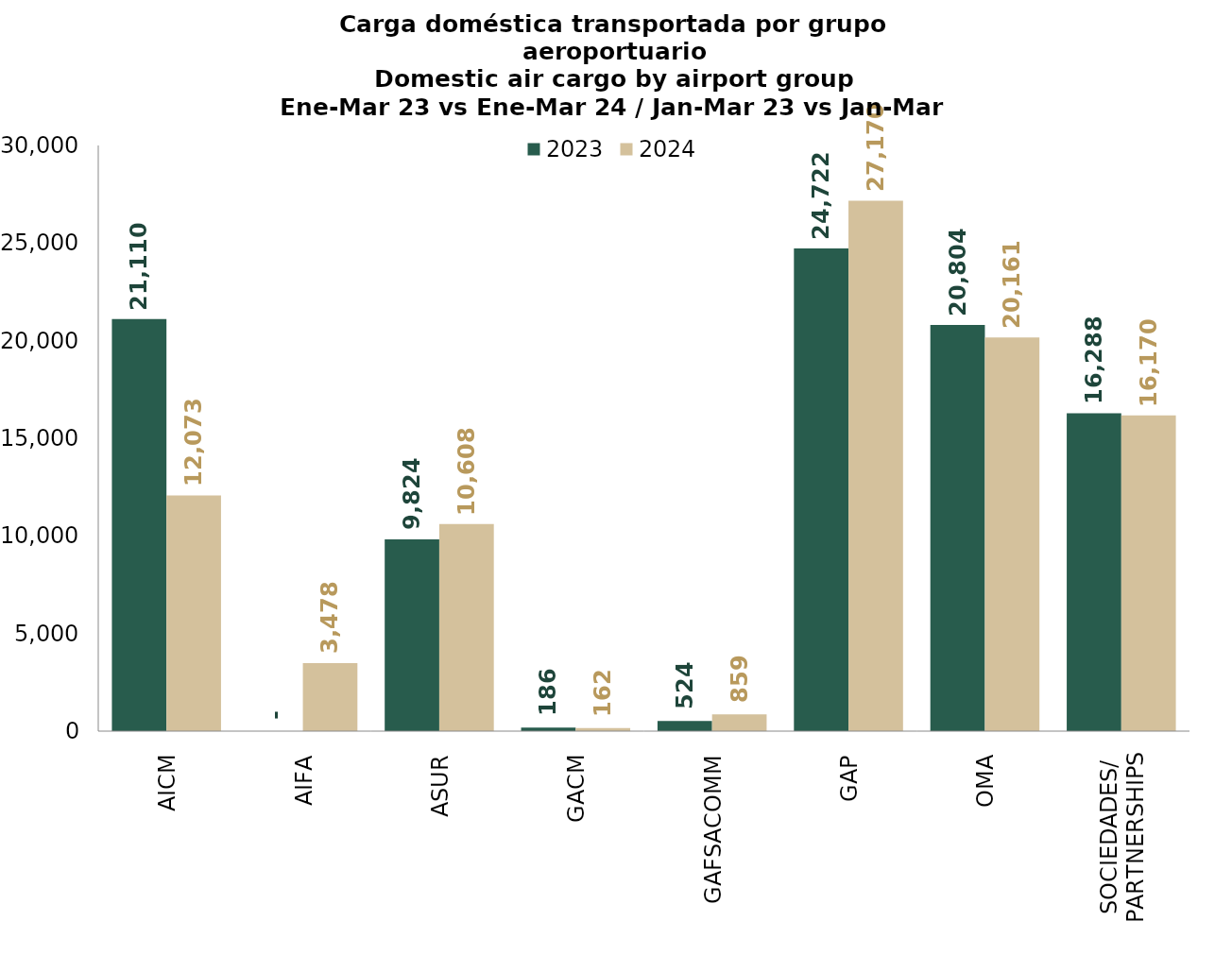
| Category | 2023 | 2024 |
|---|---|---|
| AICM | 21110.14 | 12073 |
| AIFA | 0 | 3477.903 |
| ASUR | 9824.101 | 10608.078 |
| GACM | 185.884 | 161.536 |
| GAFSACOMM | 524.072 | 858.719 |
| GAP | 24722.34 | 27169.82 |
| OMA | 20804.382 | 20160.618 |
| SOCIEDADES/
PARTNERSHIPS | 16287.74 | 16169.954 |